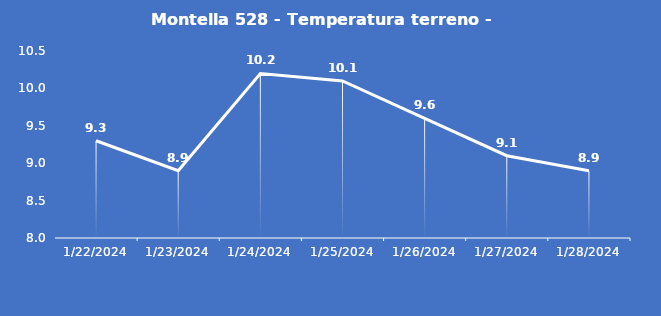
| Category | Montella 528 - Temperatura terreno - Grezzo (°C) |
|---|---|
| 1/22/24 | 9.3 |
| 1/23/24 | 8.9 |
| 1/24/24 | 10.2 |
| 1/25/24 | 10.1 |
| 1/26/24 | 9.6 |
| 1/27/24 | 9.1 |
| 1/28/24 | 8.9 |